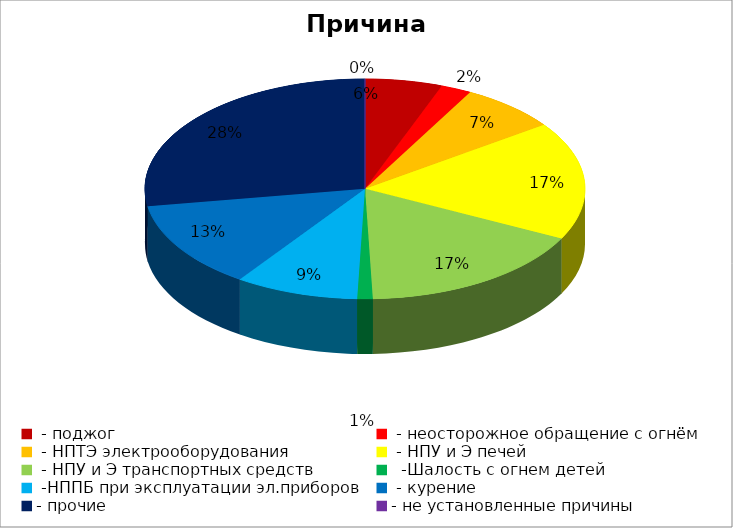
| Category | Причина пожара |
|---|---|
|  - поджог | 15 |
|  - неосторожное обращение с огнём | 6 |
|  - НПТЭ электрооборудования | 19 |
|  - НПУ и Э печей | 46 |
|  - НПУ и Э транспортных средств | 45 |
|   -Шалость с огнем детей | 3 |
|  -НППБ при эксплуатации эл.приборов | 24 |
|  - курение | 34 |
| - прочие | 73 |
| - не установленные причины | 0 |